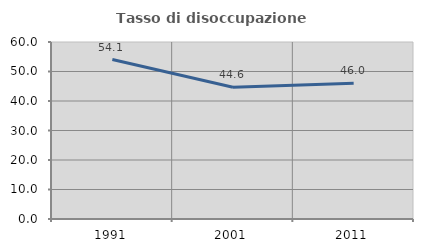
| Category | Tasso di disoccupazione giovanile  |
|---|---|
| 1991.0 | 54.054 |
| 2001.0 | 44.643 |
| 2011.0 | 46 |